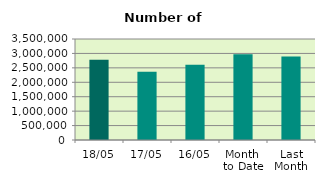
| Category | Series 0 |
|---|---|
| 18/05 | 2780918 |
| 17/05 | 2369240 |
| 16/05 | 2610014 |
| Month 
to Date | 2969452.615 |
| Last
Month | 2895009.158 |